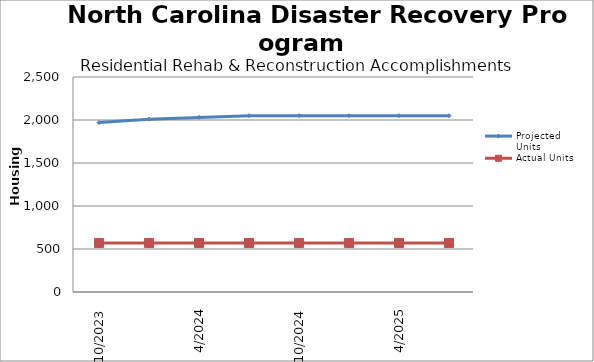
| Category | Projected Units | Actual Units |
|---|---|---|
| 10/2023 | 1970 | 570 |
| 01/2024 | 2010 | 570 |
| 4/2024 | 2030 | 570 |
| 07/2024 | 2050 | 570 |
| 10/2024 | 2050 | 570 |
| 01/2025 | 2050 | 570 |
| 4/2025 | 2050 | 570 |
| 07/2025 | 2050 | 570 |